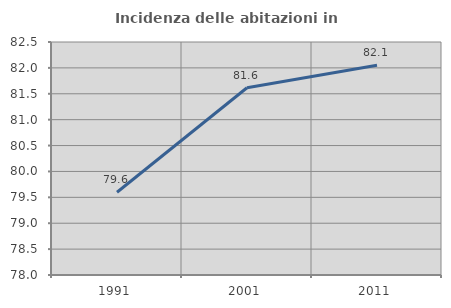
| Category | Incidenza delle abitazioni in proprietà  |
|---|---|
| 1991.0 | 79.598 |
| 2001.0 | 81.616 |
| 2011.0 | 82.051 |